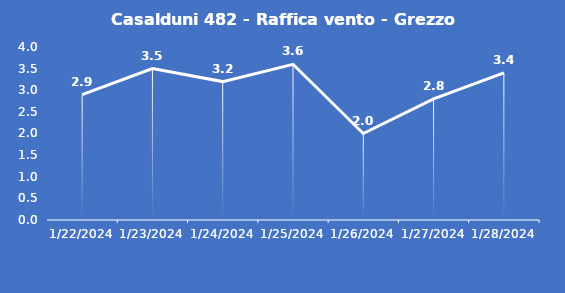
| Category | Casalduni 482 - Raffica vento - Grezzo (m/s) |
|---|---|
| 1/22/24 | 2.9 |
| 1/23/24 | 3.5 |
| 1/24/24 | 3.2 |
| 1/25/24 | 3.6 |
| 1/26/24 | 2 |
| 1/27/24 | 2.8 |
| 1/28/24 | 3.4 |